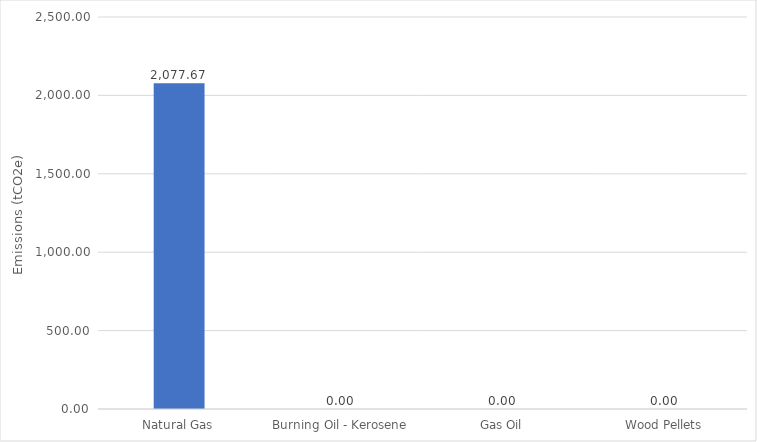
| Category | Series 0 |
|---|---|
| Natural Gas | 2077.665 |
| Burning Oil - Kerosene | 0 |
| Gas Oil | 0 |
| Wood Pellets | 0 |